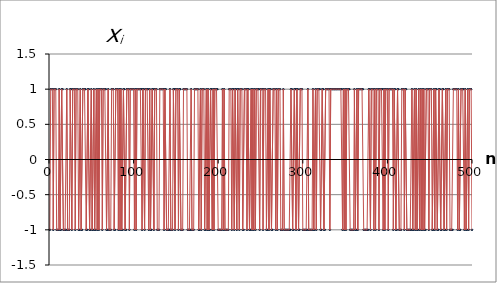
| Category | X(n) |
|---|---|
| 1.0 | -1 |
| 2.0 | 1 |
| 3.0 | 1 |
| 4.0 | 1 |
| 5.0 | -1 |
| 6.0 | 1 |
| 7.0 | 1 |
| 8.0 | 1 |
| 9.0 | -1 |
| 10.0 | -1 |
| 11.0 | -1 |
| 12.0 | 1 |
| 13.0 | -1 |
| 14.0 | -1 |
| 15.0 | 1 |
| 16.0 | 1 |
| 17.0 | -1 |
| 18.0 | -1 |
| 19.0 | -1 |
| 20.0 | -1 |
| 21.0 | 1 |
| 22.0 | -1 |
| 23.0 | -1 |
| 24.0 | -1 |
| 25.0 | 1 |
| 26.0 | 1 |
| 27.0 | -1 |
| 28.0 | 1 |
| 29.0 | 1 |
| 30.0 | 1 |
| 31.0 | -1 |
| 32.0 | 1 |
| 33.0 | 1 |
| 34.0 | 1 |
| 35.0 | -1 |
| 36.0 | -1 |
| 37.0 | 1 |
| 38.0 | -1 |
| 39.0 | -1 |
| 40.0 | 1 |
| 41.0 | 1 |
| 42.0 | 1 |
| 43.0 | 1 |
| 44.0 | -1 |
| 45.0 | -1 |
| 46.0 | 1 |
| 47.0 | 1 |
| 48.0 | -1 |
| 49.0 | -1 |
| 50.0 | 1 |
| 51.0 | -1 |
| 52.0 | -1 |
| 53.0 | 1 |
| 54.0 | -1 |
| 55.0 | -1 |
| 56.0 | 1 |
| 57.0 | -1 |
| 58.0 | 1 |
| 59.0 | -1 |
| 60.0 | 1 |
| 61.0 | 1 |
| 62.0 | 1 |
| 63.0 | -1 |
| 64.0 | 1 |
| 65.0 | 1 |
| 66.0 | 1 |
| 67.0 | 1 |
| 68.0 | -1 |
| 69.0 | -1 |
| 70.0 | 1 |
| 71.0 | -1 |
| 72.0 | -1 |
| 73.0 | -1 |
| 74.0 | 1 |
| 75.0 | 1 |
| 76.0 | 1 |
| 77.0 | -1 |
| 78.0 | -1 |
| 79.0 | 1 |
| 80.0 | 1 |
| 81.0 | 1 |
| 82.0 | -1 |
| 83.0 | 1 |
| 84.0 | -1 |
| 85.0 | 1 |
| 86.0 | -1 |
| 87.0 | -1 |
| 88.0 | 1 |
| 89.0 | 1 |
| 90.0 | -1 |
| 91.0 | -1 |
| 92.0 | 1 |
| 93.0 | 1 |
| 94.0 | 1 |
| 95.0 | -1 |
| 96.0 | 1 |
| 97.0 | 1 |
| 98.0 | 1 |
| 99.0 | 1 |
| 100.0 | 1 |
| 101.0 | -1 |
| 102.0 | 1 |
| 103.0 | -1 |
| 104.0 | 1 |
| 105.0 | 1 |
| 106.0 | 1 |
| 107.0 | 1 |
| 108.0 | 1 |
| 109.0 | 1 |
| 110.0 | -1 |
| 111.0 | 1 |
| 112.0 | 1 |
| 113.0 | -1 |
| 114.0 | 1 |
| 115.0 | 1 |
| 116.0 | 1 |
| 117.0 | 1 |
| 118.0 | -1 |
| 119.0 | 1 |
| 120.0 | -1 |
| 121.0 | -1 |
| 122.0 | 1 |
| 123.0 | 1 |
| 124.0 | -1 |
| 125.0 | 1 |
| 126.0 | 1 |
| 127.0 | 1 |
| 128.0 | -1 |
| 129.0 | -1 |
| 130.0 | -1 |
| 131.0 | 1 |
| 132.0 | 1 |
| 133.0 | 1 |
| 134.0 | 1 |
| 135.0 | 1 |
| 136.0 | -1 |
| 137.0 | 1 |
| 138.0 | 1 |
| 139.0 | -1 |
| 140.0 | -1 |
| 141.0 | -1 |
| 142.0 | -1 |
| 143.0 | 1 |
| 144.0 | -1 |
| 145.0 | -1 |
| 146.0 | -1 |
| 147.0 | 1 |
| 148.0 | 1 |
| 149.0 | -1 |
| 150.0 | 1 |
| 151.0 | 1 |
| 152.0 | 1 |
| 153.0 | -1 |
| 154.0 | 1 |
| 155.0 | 1 |
| 156.0 | -1 |
| 157.0 | -1 |
| 158.0 | -1 |
| 159.0 | 1 |
| 160.0 | 1 |
| 161.0 | 1 |
| 162.0 | 1 |
| 163.0 | 1 |
| 164.0 | -1 |
| 165.0 | -1 |
| 166.0 | -1 |
| 167.0 | -1 |
| 168.0 | 1 |
| 169.0 | -1 |
| 170.0 | -1 |
| 171.0 | -1 |
| 172.0 | 1 |
| 173.0 | 1 |
| 174.0 | 1 |
| 175.0 | 1 |
| 176.0 | 1 |
| 177.0 | -1 |
| 178.0 | -1 |
| 179.0 | 1 |
| 180.0 | -1 |
| 181.0 | 1 |
| 182.0 | 1 |
| 183.0 | 1 |
| 184.0 | -1 |
| 185.0 | -1 |
| 186.0 | 1 |
| 187.0 | -1 |
| 188.0 | 1 |
| 189.0 | -1 |
| 190.0 | -1 |
| 191.0 | 1 |
| 192.0 | 1 |
| 193.0 | -1 |
| 194.0 | 1 |
| 195.0 | -1 |
| 196.0 | 1 |
| 197.0 | 1 |
| 198.0 | 1 |
| 199.0 | 1 |
| 200.0 | -1 |
| 201.0 | -1 |
| 202.0 | -1 |
| 203.0 | -1 |
| 204.0 | -1 |
| 205.0 | 1 |
| 206.0 | -1 |
| 207.0 | 1 |
| 208.0 | -1 |
| 209.0 | -1 |
| 210.0 | -1 |
| 211.0 | -1 |
| 212.0 | -1 |
| 213.0 | 1 |
| 214.0 | 1 |
| 215.0 | 1 |
| 216.0 | -1 |
| 217.0 | 1 |
| 218.0 | 1 |
| 219.0 | -1 |
| 220.0 | 1 |
| 221.0 | 1 |
| 222.0 | -1 |
| 223.0 | 1 |
| 224.0 | 1 |
| 225.0 | -1 |
| 226.0 | 1 |
| 227.0 | 1 |
| 228.0 | 1 |
| 229.0 | -1 |
| 230.0 | -1 |
| 231.0 | 1 |
| 232.0 | 1 |
| 233.0 | 1 |
| 234.0 | -1 |
| 235.0 | 1 |
| 236.0 | 1 |
| 237.0 | -1 |
| 238.0 | -1 |
| 239.0 | 1 |
| 240.0 | -1 |
| 241.0 | 1 |
| 242.0 | -1 |
| 243.0 | 1 |
| 244.0 | -1 |
| 245.0 | 1 |
| 246.0 | 1 |
| 247.0 | 1 |
| 248.0 | 1 |
| 249.0 | -1 |
| 250.0 | 1 |
| 251.0 | 1 |
| 252.0 | 1 |
| 253.0 | -1 |
| 254.0 | 1 |
| 255.0 | 1 |
| 256.0 | 1 |
| 257.0 | -1 |
| 258.0 | -1 |
| 259.0 | 1 |
| 260.0 | -1 |
| 261.0 | 1 |
| 262.0 | 1 |
| 263.0 | -1 |
| 264.0 | -1 |
| 265.0 | 1 |
| 266.0 | 1 |
| 267.0 | 1 |
| 268.0 | -1 |
| 269.0 | 1 |
| 270.0 | -1 |
| 271.0 | 1 |
| 272.0 | 1 |
| 273.0 | 1 |
| 274.0 | -1 |
| 275.0 | -1 |
| 276.0 | -1 |
| 277.0 | 1 |
| 278.0 | -1 |
| 279.0 | -1 |
| 280.0 | -1 |
| 281.0 | -1 |
| 282.0 | -1 |
| 283.0 | -1 |
| 284.0 | -1 |
| 285.0 | -1 |
| 286.0 | 1 |
| 287.0 | 1 |
| 288.0 | -1 |
| 289.0 | -1 |
| 290.0 | 1 |
| 291.0 | 1 |
| 292.0 | -1 |
| 293.0 | 1 |
| 294.0 | 1 |
| 295.0 | -1 |
| 296.0 | -1 |
| 297.0 | 1 |
| 298.0 | 1 |
| 299.0 | 1 |
| 300.0 | -1 |
| 301.0 | -1 |
| 302.0 | -1 |
| 303.0 | -1 |
| 304.0 | -1 |
| 305.0 | -1 |
| 306.0 | 1 |
| 307.0 | -1 |
| 308.0 | -1 |
| 309.0 | -1 |
| 310.0 | -1 |
| 311.0 | -1 |
| 312.0 | 1 |
| 313.0 | -1 |
| 314.0 | -1 |
| 315.0 | 1 |
| 316.0 | -1 |
| 317.0 | 1 |
| 318.0 | 1 |
| 319.0 | 1 |
| 320.0 | 1 |
| 321.0 | -1 |
| 322.0 | -1 |
| 323.0 | 1 |
| 324.0 | 1 |
| 325.0 | -1 |
| 326.0 | -1 |
| 327.0 | 1 |
| 328.0 | 1 |
| 329.0 | 1 |
| 330.0 | 1 |
| 331.0 | 1 |
| 332.0 | -1 |
| 333.0 | 1 |
| 334.0 | 1 |
| 335.0 | 1 |
| 336.0 | 1 |
| 337.0 | 1 |
| 338.0 | 1 |
| 339.0 | 1 |
| 340.0 | 1 |
| 341.0 | 1 |
| 342.0 | 1 |
| 343.0 | 1 |
| 344.0 | 1 |
| 345.0 | 1 |
| 346.0 | 1 |
| 347.0 | -1 |
| 348.0 | 1 |
| 349.0 | -1 |
| 350.0 | 1 |
| 351.0 | -1 |
| 352.0 | 1 |
| 353.0 | 1 |
| 354.0 | 1 |
| 355.0 | 1 |
| 356.0 | -1 |
| 357.0 | -1 |
| 358.0 | -1 |
| 359.0 | -1 |
| 360.0 | -1 |
| 361.0 | 1 |
| 362.0 | -1 |
| 363.0 | -1 |
| 364.0 | 1 |
| 365.0 | -1 |
| 366.0 | 1 |
| 367.0 | 1 |
| 368.0 | 1 |
| 369.0 | 1 |
| 370.0 | 1 |
| 371.0 | 1 |
| 372.0 | -1 |
| 373.0 | -1 |
| 374.0 | -1 |
| 375.0 | -1 |
| 376.0 | -1 |
| 377.0 | -1 |
| 378.0 | 1 |
| 379.0 | 1 |
| 380.0 | -1 |
| 381.0 | 1 |
| 382.0 | 1 |
| 383.0 | 1 |
| 384.0 | -1 |
| 385.0 | 1 |
| 386.0 | -1 |
| 387.0 | 1 |
| 388.0 | 1 |
| 389.0 | 1 |
| 390.0 | -1 |
| 391.0 | 1 |
| 392.0 | 1 |
| 393.0 | 1 |
| 394.0 | 1 |
| 395.0 | -1 |
| 396.0 | 1 |
| 397.0 | -1 |
| 398.0 | 1 |
| 399.0 | 1 |
| 400.0 | 1 |
| 401.0 | -1 |
| 402.0 | 1 |
| 403.0 | 1 |
| 404.0 | 1 |
| 405.0 | 1 |
| 406.0 | 1 |
| 407.0 | -1 |
| 408.0 | 1 |
| 409.0 | 1 |
| 410.0 | -1 |
| 411.0 | -1 |
| 412.0 | 1 |
| 413.0 | 1 |
| 414.0 | -1 |
| 415.0 | -1 |
| 416.0 | -1 |
| 417.0 | 1 |
| 418.0 | 1 |
| 419.0 | 1 |
| 420.0 | -1 |
| 421.0 | 1 |
| 422.0 | 1 |
| 423.0 | -1 |
| 424.0 | -1 |
| 425.0 | -1 |
| 426.0 | -1 |
| 427.0 | -1 |
| 428.0 | -1 |
| 429.0 | 1 |
| 430.0 | -1 |
| 431.0 | -1 |
| 432.0 | 1 |
| 433.0 | -1 |
| 434.0 | 1 |
| 435.0 | -1 |
| 436.0 | -1 |
| 437.0 | 1 |
| 438.0 | -1 |
| 439.0 | 1 |
| 440.0 | -1 |
| 441.0 | 1 |
| 442.0 | -1 |
| 443.0 | 1 |
| 444.0 | -1 |
| 445.0 | -1 |
| 446.0 | 1 |
| 447.0 | 1 |
| 448.0 | 1 |
| 449.0 | -1 |
| 450.0 | 1 |
| 451.0 | 1 |
| 452.0 | 1 |
| 453.0 | -1 |
| 454.0 | -1 |
| 455.0 | 1 |
| 456.0 | -1 |
| 457.0 | 1 |
| 458.0 | 1 |
| 459.0 | -1 |
| 460.0 | -1 |
| 461.0 | 1 |
| 462.0 | 1 |
| 463.0 | -1 |
| 464.0 | -1 |
| 465.0 | 1 |
| 466.0 | 1 |
| 467.0 | -1 |
| 468.0 | -1 |
| 469.0 | 1 |
| 470.0 | -1 |
| 471.0 | 1 |
| 472.0 | 1 |
| 473.0 | 1 |
| 474.0 | -1 |
| 475.0 | -1 |
| 476.0 | -1 |
| 477.0 | -1 |
| 478.0 | 1 |
| 479.0 | 1 |
| 480.0 | 1 |
| 481.0 | 1 |
| 482.0 | 1 |
| 483.0 | -1 |
| 484.0 | 1 |
| 485.0 | -1 |
| 486.0 | -1 |
| 487.0 | 1 |
| 488.0 | 1 |
| 489.0 | 1 |
| 490.0 | 1 |
| 491.0 | -1 |
| 492.0 | 1 |
| 493.0 | -1 |
| 494.0 | -1 |
| 495.0 | 1 |
| 496.0 | -1 |
| 497.0 | 1 |
| 498.0 | 1 |
| 499.0 | 1 |
| 500.0 | -1 |